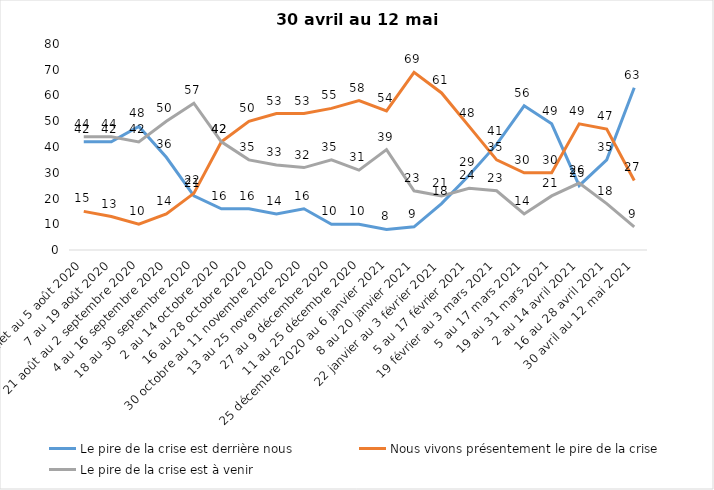
| Category | Le pire de la crise est derrière nous | Nous vivons présentement le pire de la crise | Le pire de la crise est à venir |
|---|---|---|---|
| 24 juillet au 5 août 2020 | 42 | 15 | 44 |
| 7 au 19 août 2020 | 42 | 13 | 44 |
| 21 août au 2 septembre 2020 | 48 | 10 | 42 |
| 4 au 16 septembre 2020 | 36 | 14 | 50 |
| 18 au 30 septembre 2020 | 21 | 22 | 57 |
| 2 au 14 octobre 2020 | 16 | 42 | 42 |
| 16 au 28 octobre 2020 | 16 | 50 | 35 |
| 30 octobre au 11 novembre 2020 | 14 | 53 | 33 |
| 13 au 25 novembre 2020 | 16 | 53 | 32 |
| 27 au 9 décembre 2020 | 10 | 55 | 35 |
| 11 au 25 décembre 2020 | 10 | 58 | 31 |
| 25 décembre 2020 au 6 janvier 2021 | 8 | 54 | 39 |
| 8 au 20 janvier 2021 | 9 | 69 | 23 |
| 22 janvier au 3 février 2021 | 18 | 61 | 21 |
| 5 au 17 février 2021 | 29 | 48 | 24 |
| 19 février au 3 mars 2021 | 41 | 35 | 23 |
| 5 au 17 mars 2021 | 56 | 30 | 14 |
| 19 au 31 mars 2021 | 49 | 30 | 21 |
| 2 au 14 avril 2021 | 25 | 49 | 26 |
| 16 au 28 avril 2021 | 35 | 47 | 18 |
| 30 avril au 12 mai 2021 | 63 | 27 | 9 |